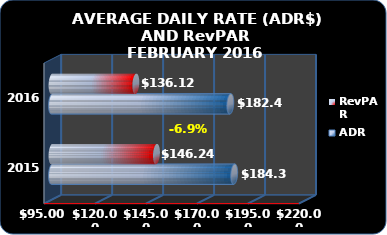
| Category | ADR | RevPAR |
|---|---|---|
| 2016.0 | 182.46 | 136.12 |
| 2015.0 | 184.376 | 146.244 |